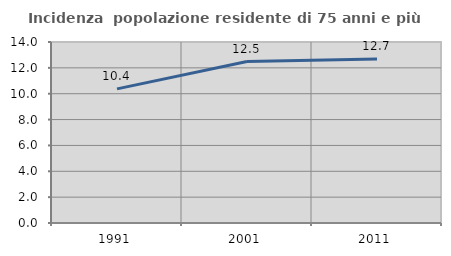
| Category | Incidenza  popolazione residente di 75 anni e più |
|---|---|
| 1991.0 | 10.377 |
| 2001.0 | 12.485 |
| 2011.0 | 12.685 |